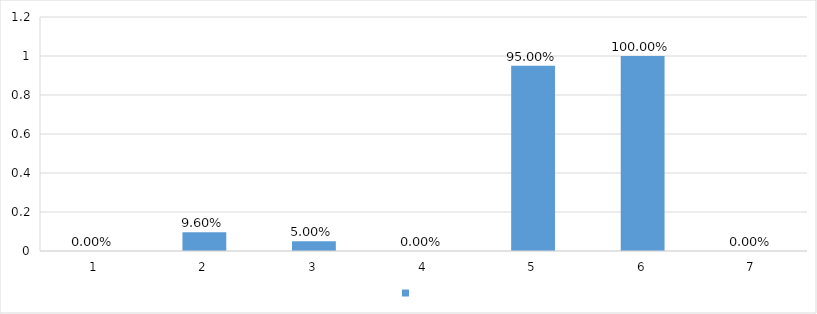
| Category | Series 0 |
|---|---|
| 1 | 0 |
| 2 | 0.096 |
| 3 | 0.05 |
| 4 | 0 |
| 5 | 0.95 |
| 6 | 1 |
| 7 | 0 |